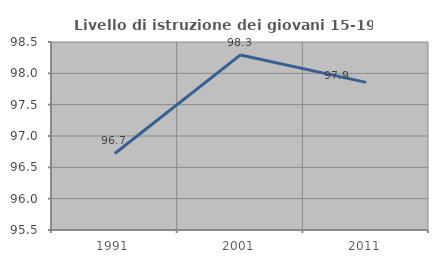
| Category | Livello di istruzione dei giovani 15-19 anni |
|---|---|
| 1991.0 | 96.721 |
| 2001.0 | 98.294 |
| 2011.0 | 97.855 |